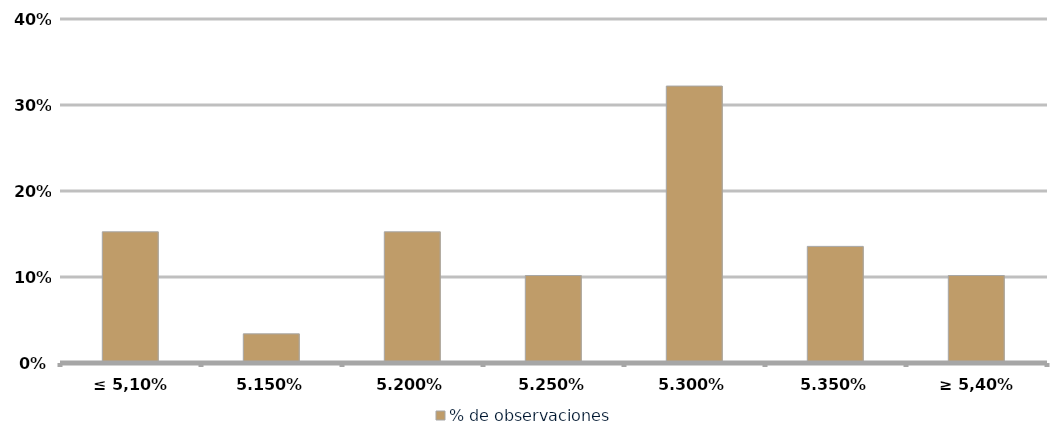
| Category | % de observaciones  |
|---|---|
| ≤ 5,10% | 0.153 |
| 5,15% | 0.034 |
| 5,20% | 0.153 |
| 5,25% | 0.102 |
| 5,30% | 0.322 |
| 5,35% | 0.136 |
| ≥ 5,40% | 0.102 |